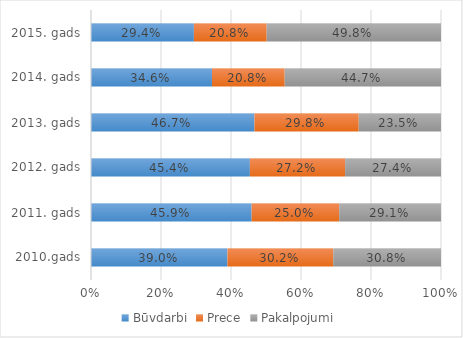
| Category | Būvdarbi | Prece | Pakalpojumi |
|---|---|---|---|
| 2010.gads | 0.39 | 0.302 | 0.308 |
| 2011. gads | 0.459 | 0.25 | 0.291 |
| 2012. gads | 0.454 | 0.272 | 0.274 |
| 2013. gads | 0.467 | 0.298 | 0.235 |
| 2014. gads | 0.346 | 0.208 | 0.447 |
| 2015. gads | 0.294 | 0.208 | 0.498 |